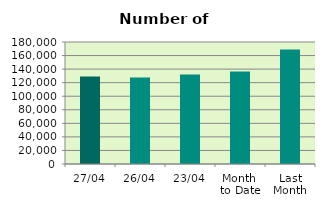
| Category | Series 0 |
|---|---|
| 27/04 | 129118 |
| 26/04 | 127630 |
| 23/04 | 132016 |
| Month 
to Date | 136632.588 |
| Last
Month | 168827.304 |